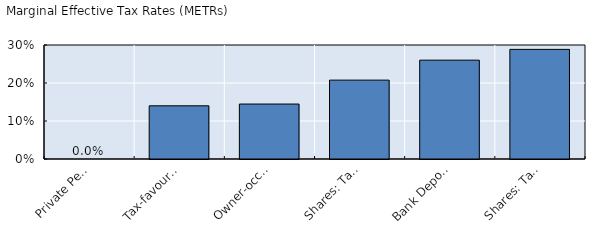
| Category | t |
|---|---|
| Private Pensions with deductible contributions | 0 |
| Tax-favoured savings accounts | 0.14 |
| Owner-occupied residential property | 0.145 |
| Shares: Taxed as Cap. Gains | 0.208 |
| Bank Deposits | 0.26 |
| Shares: Taxed as Dividends | 0.289 |